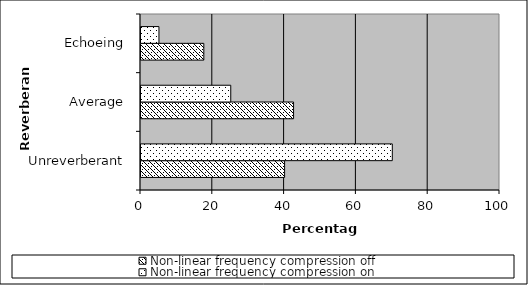
| Category | Non-linear frequency compression off | Non-linear frequency compression on |
|---|---|---|
| Unreverberant | 40 | 70 |
| Average | 42.5 | 25 |
| Echoeing | 17.5 | 5 |